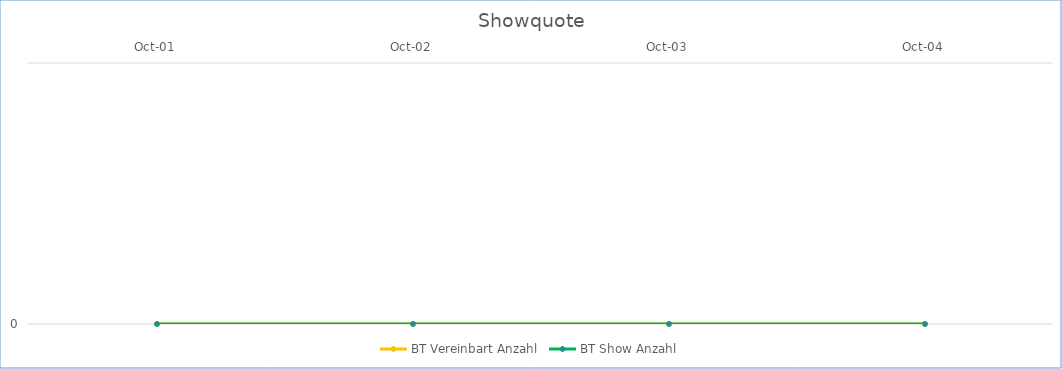
| Category | BT Vereinbart Anzahl | BT Show Anzahl |
|---|---|---|
| 2001-10-01 | 0 | 0 |
| 2002-10-01 | 0 | 0 |
| 2003-10-01 | 0 | 0 |
| 2004-10-01 | 0 | 0 |